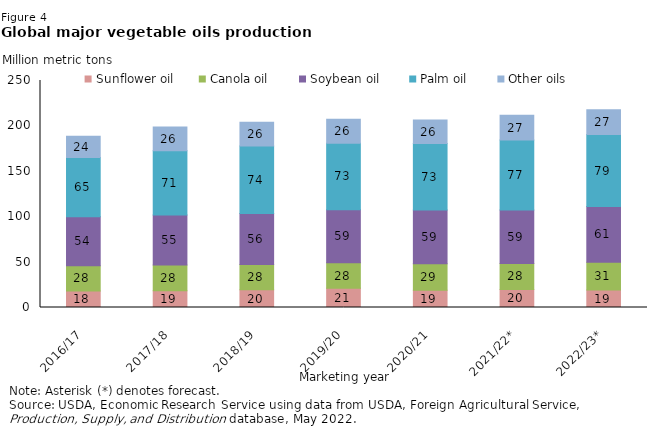
| Category | Sunflower oil | Canola oil  | Soybean oil  | Palm oil  | Other oils |
|---|---|---|---|---|---|
| 2016/17 | 18.3 | 27.602 | 53.909 | 65.263 | 23.515 |
| 2017/18 | 18.578 | 28.132 | 55.279 | 70.64 | 26.094 |
| 2018/19 | 19.603 | 27.794 | 56.062 | 74.276 | 26.162 |
| 2019/20 | 21.118 | 28.101 | 58.521 | 73.105 | 26.455 |
| 2020/21 | 19.044 | 29.217 | 59.165 | 73.129 | 25.989 |
| 2021/22* | 19.913 | 28.474 | 59.112 | 76.948 | 27.258 |
| 2022/23* | 19.136 | 30.741 | 61.429 | 79.127 | 27.284 |